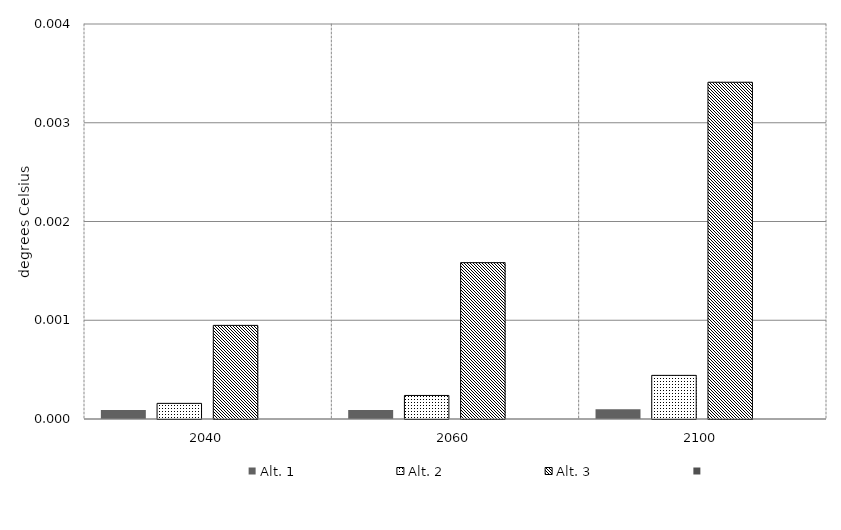
| Category | Alt. 1 | Alt. 2 | Alt. 3 | Series 3 | Alt 5 | Alt 6 | Alt 7 | Alt 8 | Alt 10 |
|---|---|---|---|---|---|---|---|---|---|
| 2040.0 | 0 | 0 | 0.001 |  |  |  |  |  |  |
| 2060.0 | 0 | 0 | 0.002 |  |  |  |  |  |  |
| 2100.0 | 0 | 0 | 0.003 |  |  |  |  |  |  |